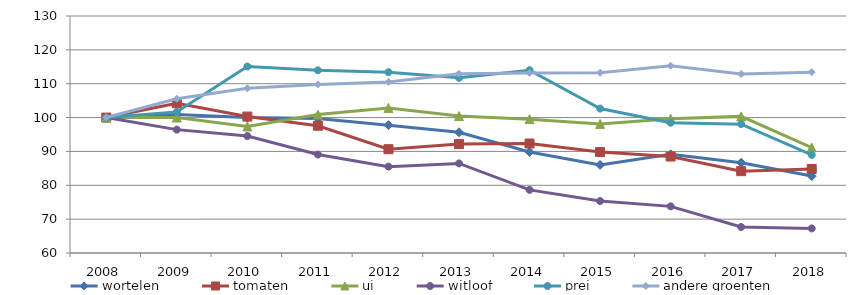
| Category | wortelen | tomaten | ui | witloof | prei | andere groenten |
|---|---|---|---|---|---|---|
| 2008.0 | 100 | 100 | 100 | 100 | 100 | 100 |
| 2009.0 | 100.898 | 104.217 | 100 | 96.437 | 101.676 | 105.545 |
| 2010.0 | 100 | 100.301 | 97.374 | 94.537 | 115.084 | 108.626 |
| 2011.0 | 99.701 | 97.59 | 100.875 | 89.074 | 113.966 | 109.797 |
| 2012.0 | 97.754 | 90.663 | 102.845 | 85.511 | 113.408 | 110.536 |
| 2013.0 | 95.659 | 92.169 | 100.438 | 86.461 | 111.732 | 112.939 |
| 2014.0 | 89.837 | 92.335 | 99.537 | 78.649 | 113.997 | 113.173 |
| 2015.0 | 86.019 | 89.808 | 98.116 | 75.342 | 102.659 | 113.221 |
| 2016.0 | 89.144 | 88.495 | 99.651 | 73.775 | 98.482 | 115.299 |
| 2017.0 | 86.66 | 84.171 | 100.35 | 67.675 | 98.064 | 112.881 |
| 2018.0 | 82.725 | 84.811 | 91.158 | 67.257 | 88.959 | 113.402 |